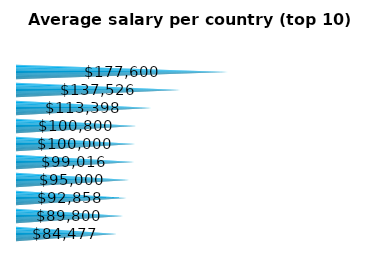
| Category | Average salary per country (top 10) |
|---|---|
| Sweden (2) | 84477.26 |
| Canada (58) | 89799.527 |
| Australia (81) | 92857.63 |
| Central America (1) | 95000 |
| Norway (7) | 99016.174 |
| Uganda (1) | 100000 |
| Oman (1) | 100800 |
| Europe (7) | 113397.531 |
| Switzerland (4) | 137525.557 |
| Lesotho (1) | 177600 |